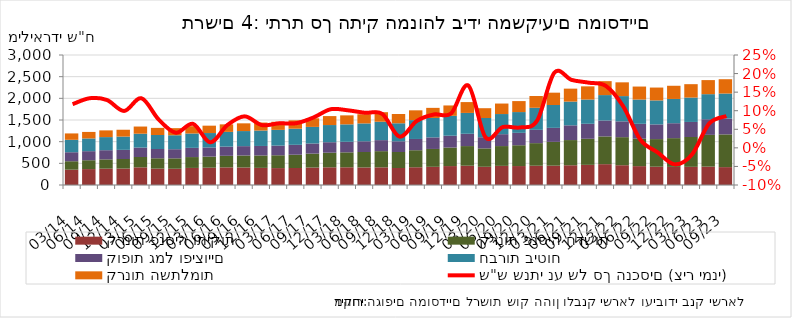
| Category | קרנות פנסיה ותיקות | קרנות פנסיה חדשות | קופות גמל ופיצויים | חברות ביטוח | קרנות השתלמות |
|---|---|---|---|---|---|
| 2014-03-31 | 353841.237 | 194503.566 | 207855.448 | 286937.671 | 147050.79 |
| 2014-06-30 | 367347.109 | 204231.289 | 209018.825 | 293685.099 | 150456.911 |
| 2014-09-30 | 376835.81 | 214231.406 | 212122.612 | 302166.651 | 155186.364 |
| 2014-12-31 | 379149.747 | 220941.602 | 211145.904 | 306088.457 | 157811.406 |
| 2015-03-31 | 407766.852 | 238480.103 | 217541.262 | 320021.053 | 165379.123 |
| 2015-06-30 | 377998.91 | 238584.047 | 213964.644 | 323046.986 | 164673.63 |
| 2015-09-30 | 375003.671 | 240239.995 | 210631.449 | 321958.368 | 164024.895 |
| 2015-12-31 | 394009.261 | 250710.3 | 212571.186 | 330789.846 | 169409.673 |
| 2016-03-31 | 399560.392 | 256138.452 | 210717.212 | 332791.969 | 169965.765 |
| 2016-06-30 | 407029.119 | 266330.142 | 212719.128 | 339548.345 | 173857.09 |
| 2016-09-30 | 404282.94 | 276548.745 | 215975.352 | 347964.478 | 178395.11 |
| 2016-12-31 | 395218.356 | 286472.786 | 219236.832 | 355928.441 | 183799.701 |
| 2017-03-31 | 390378.339 | 295724.533 | 222912.57 | 363011.334 | 187566.428 |
| 2017-06-30 | 391709.081 | 307141.439 | 228329.728 | 372231.012 | 192874.939 |
| 2017-09-30 | 402740.093 | 321661.487 | 233741.441 | 382646.482 | 198731.491 |
| 2017-12-31 | 408397.183 | 337110.231 | 241863.688 | 396293.151 | 206768.207 |
| 2018-03-31 | 408963.351 | 344950.856 | 243400.808 | 402045.85 | 207767.029 |
| 2018-06-30 | 404980.359 | 356723.509 | 247271.377 | 412065.083 | 212149.531 |
| 2018-09-30 | 407549.506 | 373583.03 | 254365.581 | 424811.464 | 219817.214 |
| 2018-12-31 | 392610.35 | 369066.721 | 247165.547 | 415663.942 | 214152.19 |
| 2019-03-31 | 409682.434 | 392949.873 | 259599.347 | 435130.795 | 225972.39 |
| 2019-06-30 | 419699.746 | 412238.813 | 266829.127 | 448024.74 | 233337.284 |
| 2019-09-30 | 436873.365 | 427408.051 | 273305.515 | 458457.617 | 239774.326 |
| 2019-12-31 | 445070.178 | 453159.976 | 283994.45 | 481206.961 | 250173.86 |
| 2020-03-31 | 420264.639 | 424460.557 | 257990.521 | 443809.629 | 225647.442 |
| 2020-06-30 | 441583.014 | 456963.565 | 274382.869 | 464715.564 | 242032.798 |
| 2020-09-30 | 437471.661 | 480207.453 | 285869.533 | 479529.895 | 253459.669 |
| 2020-12-31 | 444730.312 | 521341.893 | 307058.721 | 508635.702 | 272631.199 |
| 2021-03-31 | 445846.383 | 549551.75 | 323387.197 | 527059.137 | 284834.843 |
| 2021-06-30 | 455642.782 | 581354.211 | 340022.339 | 547917.213 | 298732.086 |
| 2021-09-30 | 464891.868 | 601622.772 | 346161.906 | 559765.909 | 303953.763 |
| 2021-12-31 | 481035.907 | 640332.283 | 367096.291 | 586510.775 | 321477.273 |
| 2022-03-31 | 456364.834 | 647866.377 | 364714.734 | 582900.247 | 317423.711 |
| 2022-06-30 | 435454.051 | 632258.662 | 344442.779 | 560247.736 | 299535.625 |
| 2022-09-30 | 422096.78 | 637197.331 | 338973.173 | 553689.087 | 296831.372 |
| 2022-12-31 | 418242.028 | 663252.805 | 344241.884 | 560064.527 | 304118.618 |
| 2023-03-31 | 419238.201 | 688496.181 | 347290.177 | 562771.855 | 308995.303 |
| 2023-06-30 | 424281.593 | 732625.871 | 361541.166 | 577640.063 | 324662.57 |
| 2023-09-30 | 412695.235 | 755112.415 | 365402.219 | 577636.283 | 330381.458 |